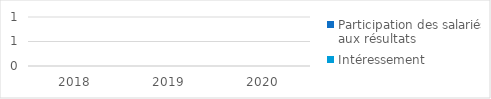
| Category | Participation des salariés aux résultats | Intéressement |
|---|---|---|
| 2018.0 | 0 | 0 |
| 2019.0 | 0 | 0 |
| 2020.0 | 0 | 0 |